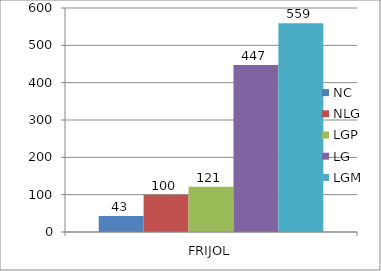
| Category | NC | NLG | LGP | LG | LGM |
|---|---|---|---|---|---|
| 0 | 43 | 100 | 121 | 447 | 559 |